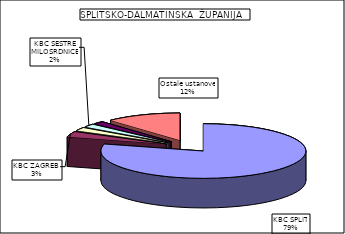
| Category | Series 0 |
|---|---|
| KBC SPLIT | 79.15 |
| KBC ZAGREB  | 3.305 |
| SPECIJALNA BOLNICA  "BIOKOVKA" | 2.089 |
| KBC SESTRE MILOSRDNICE | 1.962 |
| SPECIJALNA BOLNICA ZA MEDICINSKU REHABILITACIJU  "KALOS" | 1.664 |
| Ostale ustanove | 11.829 |